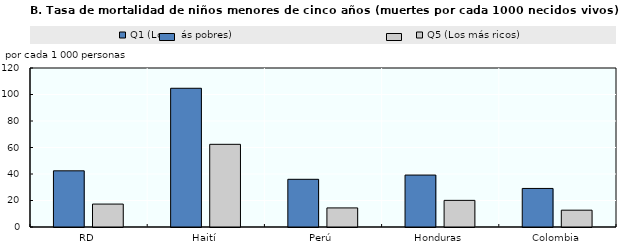
| Category | Q1 (Los más pobres) | Q5 (Los más ricos) |
|---|---|---|
| RD | 42.4 | 17.3 |
| Haití | 104.7 | 62.4 |
| Perú | 36 | 14.4 |
| Honduras | 39.2 | 20.1 |
| Colombia | 29.1 | 12.7 |